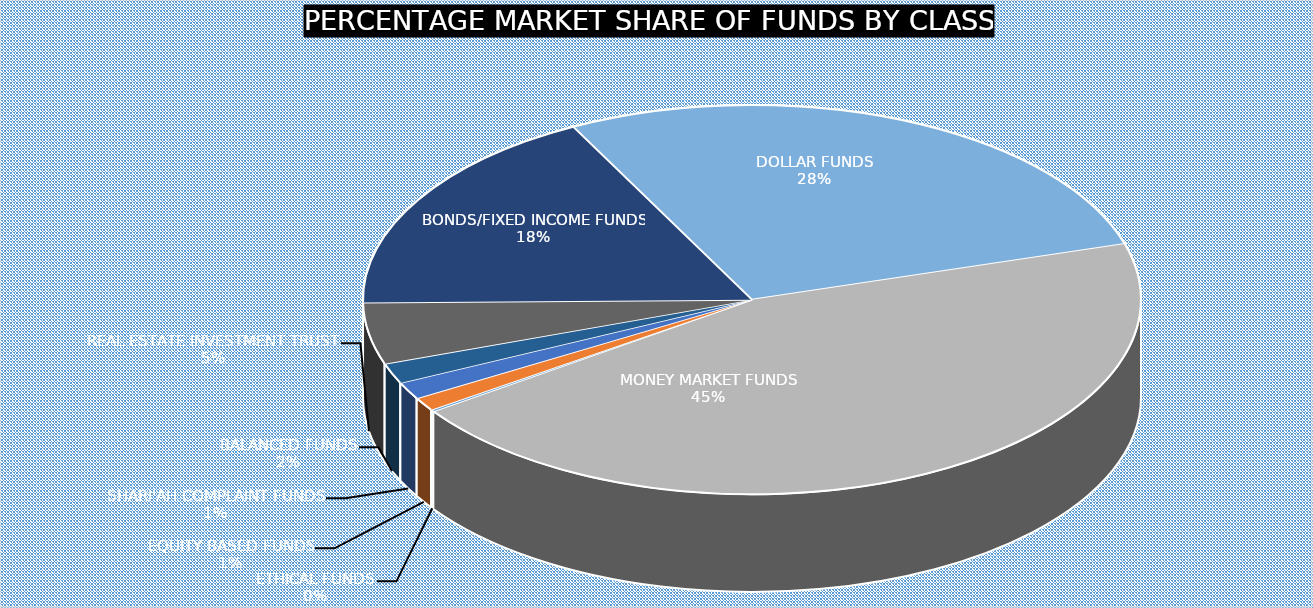
| Category | June 2023 |
|---|---|
| ETHICAL FUNDS | 2799584327.81 |
| EQUITY BASED FUNDS | 20083601851.88 |
| SHARI'AH COMPLAINT FUNDS | 25987755009.91 |
| BALANCED FUNDS | 30761614356.48 |
| REAL ESTATE INVESTMENT TRUST | 92907293507.54 |
| BONDS/FIXED INCOME FUNDS | 320654385205.9 |
| DOLLAR FUNDS | 508822827375.848 |
| MONEY MARKET FUNDS | 816072018420.13 |